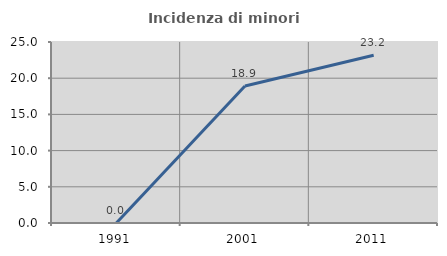
| Category | Incidenza di minori stranieri |
|---|---|
| 1991.0 | 0 |
| 2001.0 | 18.919 |
| 2011.0 | 23.171 |